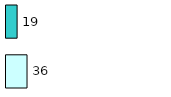
| Category | Series 0 | Series 1 |
|---|---|---|
| 0 | 36 | 19 |